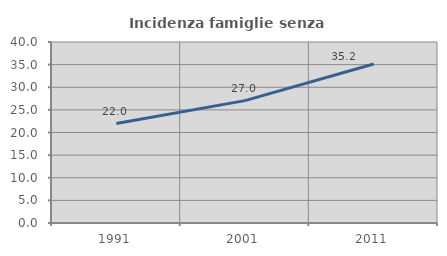
| Category | Incidenza famiglie senza nuclei |
|---|---|
| 1991.0 | 21.98 |
| 2001.0 | 27.046 |
| 2011.0 | 35.152 |